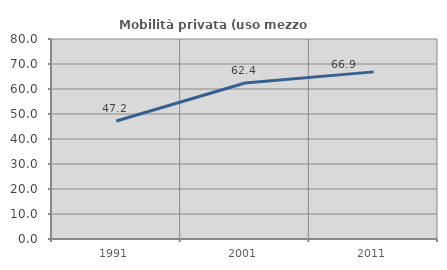
| Category | Mobilità privata (uso mezzo privato) |
|---|---|
| 1991.0 | 47.222 |
| 2001.0 | 62.42 |
| 2011.0 | 66.851 |